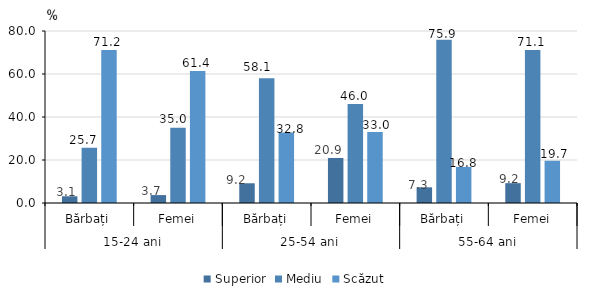
| Category | Superior | Mediu | Scăzut |
|---|---|---|---|
| 0 | 3.125 | 25.659 | 71.216 |
| 1 | 3.679 | 34.962 | 61.359 |
| 2 | 9.173 | 58.055 | 32.771 |
| 3 | 20.92 | 46.036 | 33.044 |
| 4 | 7.292 | 75.919 | 16.788 |
| 5 | 9.228 | 71.116 | 19.656 |